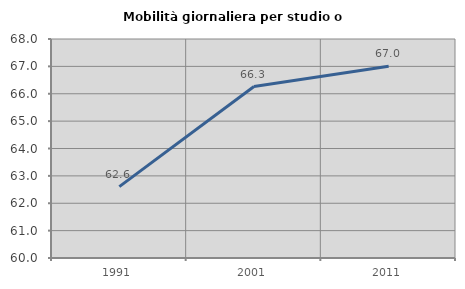
| Category | Mobilità giornaliera per studio o lavoro |
|---|---|
| 1991.0 | 62.606 |
| 2001.0 | 66.262 |
| 2011.0 | 67.005 |